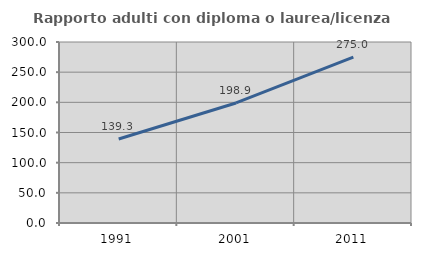
| Category | Rapporto adulti con diploma o laurea/licenza media  |
|---|---|
| 1991.0 | 139.278 |
| 2001.0 | 198.94 |
| 2011.0 | 274.959 |